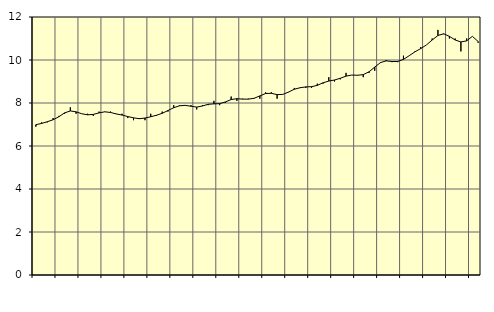
| Category | Piggar | Offentlig förvaltning m.m., SNI 84, 99 |
|---|---|---|
| nan | 6.9 | 6.99 |
| 1.0 | 7.1 | 7.05 |
| 1.0 | 7.1 | 7.13 |
| 1.0 | 7.3 | 7.22 |
| nan | 7.4 | 7.36 |
| 2.0 | 7.5 | 7.54 |
| 2.0 | 7.8 | 7.63 |
| 2.0 | 7.5 | 7.59 |
| nan | 7.5 | 7.5 |
| 3.0 | 7.5 | 7.45 |
| 3.0 | 7.4 | 7.47 |
| 3.0 | 7.6 | 7.54 |
| nan | 7.6 | 7.59 |
| 4.0 | 7.6 | 7.56 |
| 4.0 | 7.5 | 7.49 |
| 4.0 | 7.5 | 7.44 |
| nan | 7.3 | 7.37 |
| 5.0 | 7.2 | 7.31 |
| 5.0 | 7.3 | 7.27 |
| 5.0 | 7.2 | 7.3 |
| nan | 7.5 | 7.36 |
| 6.0 | 7.4 | 7.43 |
| 6.0 | 7.6 | 7.52 |
| 6.0 | 7.6 | 7.65 |
| nan | 7.9 | 7.78 |
| 7.0 | 7.9 | 7.87 |
| 7.0 | 7.9 | 7.89 |
| 7.0 | 7.9 | 7.85 |
| nan | 7.7 | 7.81 |
| 8.0 | 7.9 | 7.86 |
| 8.0 | 7.9 | 7.94 |
| 8.0 | 8.1 | 7.96 |
| nan | 7.9 | 7.97 |
| 9.0 | 8 | 8.05 |
| 9.0 | 8.3 | 8.16 |
| 9.0 | 8.1 | 8.2 |
| nan | 8.2 | 8.18 |
| 10.0 | 8.2 | 8.18 |
| 10.0 | 8.2 | 8.22 |
| 10.0 | 8.2 | 8.33 |
| nan | 8.5 | 8.44 |
| 11.0 | 8.5 | 8.45 |
| 11.0 | 8.2 | 8.39 |
| 11.0 | 8.4 | 8.4 |
| nan | 8.5 | 8.51 |
| 12.0 | 8.7 | 8.64 |
| 12.0 | 8.7 | 8.71 |
| 12.0 | 8.7 | 8.75 |
| nan | 8.7 | 8.76 |
| 13.0 | 8.9 | 8.82 |
| 13.0 | 8.9 | 8.94 |
| 13.0 | 9.2 | 9.02 |
| nan | 9 | 9.07 |
| 14.0 | 9.1 | 9.15 |
| 14.0 | 9.4 | 9.25 |
| 14.0 | 9.3 | 9.3 |
| nan | 9.3 | 9.29 |
| 15.0 | 9.2 | 9.32 |
| 15.0 | 9.4 | 9.45 |
| 15.0 | 9.5 | 9.67 |
| nan | 9.9 | 9.88 |
| 16.0 | 10 | 9.96 |
| 16.0 | 9.9 | 9.93 |
| 16.0 | 9.9 | 9.93 |
| nan | 10.2 | 10.03 |
| 17.0 | 10.2 | 10.2 |
| 17.0 | 10.4 | 10.38 |
| 17.0 | 10.6 | 10.53 |
| nan | 10.7 | 10.7 |
| 18.0 | 11 | 10.93 |
| 18.0 | 11.4 | 11.14 |
| 18.0 | 11.2 | 11.22 |
| nan | 11 | 11.1 |
| 19.0 | 11 | 10.93 |
| 19.0 | 10.4 | 10.84 |
| 19.0 | 11 | 10.89 |
| nan | 11.1 | 11.1 |
| 20.0 | 10.8 | 10.86 |